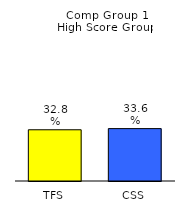
| Category | Series 0 |
|---|---|
| TFS | 0.328 |
| CSS | 0.336 |